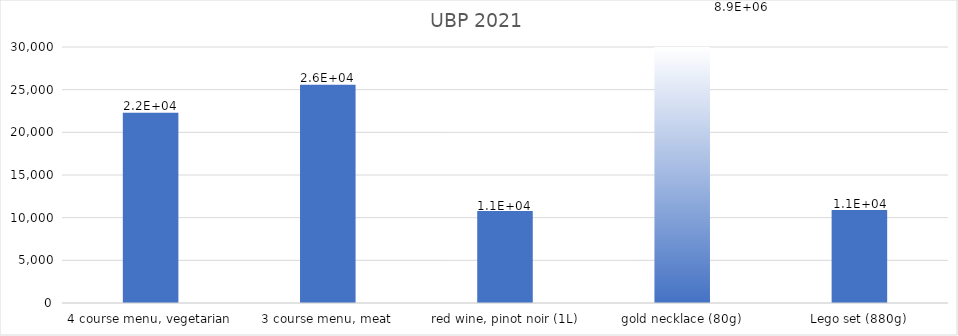
| Category | UBP 2021 |
|---|---|
| 4 course menu, vegetarian | 22303.645 |
| 3 course menu, meat | 25570.454 |
| red wine, pinot noir (1L) | 10787.093 |
| gold necklace (80g) | 8899912 |
| Lego set (880g) | 10888.532 |